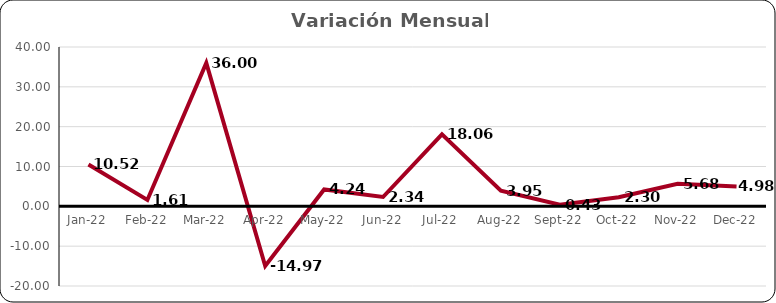
| Category | Variación
Mensual % |
|---|---|
| 2022-01-01 | 10.52 |
| 2022-02-01 | 1.609 |
| 2022-03-01 | 35.998 |
| 2022-04-01 | -14.966 |
| 2022-05-01 | 4.242 |
| 2022-06-01 | 2.343 |
| 2022-07-01 | 18.064 |
| 2022-08-01 | 3.945 |
| 2022-09-01 | 0.428 |
| 2022-10-01 | 2.297 |
| 2022-11-01 | 5.675 |
| 2022-12-01 | 4.985 |